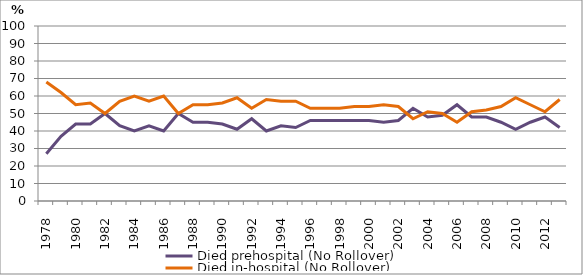
| Category | Died prehospital (No Rollover) | Died in-hospital (No Rollover) |
|---|---|---|
| 1978.0 | 27 | 68 |
| 1979.0 | 37 | 62 |
| 1980.0 | 44 | 55 |
| 1981.0 | 44 | 56 |
| 1982.0 | 50 | 50 |
| 1983.0 | 43 | 57 |
| 1984.0 | 40 | 60 |
| 1985.0 | 43 | 57 |
| 1986.0 | 40 | 60 |
| 1987.0 | 50 | 50 |
| 1988.0 | 45 | 55 |
| 1989.0 | 45 | 55 |
| 1990.0 | 44 | 56 |
| 1991.0 | 41 | 59 |
| 1992.0 | 47 | 53 |
| 1993.0 | 40 | 58 |
| 1994.0 | 43 | 57 |
| 1995.0 | 42 | 57 |
| 1996.0 | 46 | 53 |
| 1997.0 | 46 | 53 |
| 1998.0 | 46 | 53 |
| 1999.0 | 46 | 54 |
| 2000.0 | 46 | 54 |
| 2001.0 | 45 | 55 |
| 2002.0 | 46 | 54 |
| 2003.0 | 53 | 47 |
| 2004.0 | 48 | 51 |
| 2005.0 | 49 | 50 |
| 2006.0 | 55 | 45 |
| 2007.0 | 48 | 51 |
| 2008.0 | 48 | 52 |
| 2009.0 | 45 | 54 |
| 2010.0 | 41 | 59 |
| 2011.0 | 45 | 55 |
| 2012.0 | 48 | 51 |
| 2013.0 | 42 | 58 |